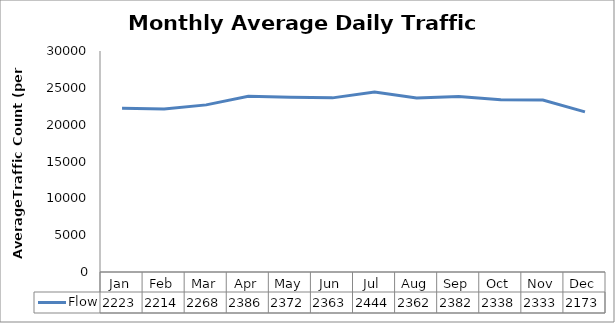
| Category | Flow |
|---|---|
| Jan | 22230.75 |
| Feb | 22143.5 |
| Mar | 22686.25 |
| Apr | 23867 |
| May | 23724.5 |
| Jun | 23637.75 |
| Jul | 24442 |
| Aug | 23622 |
| Sep | 23828.25 |
| Oct | 23380.25 |
| Nov | 23336.75 |
| Dec | 21730 |